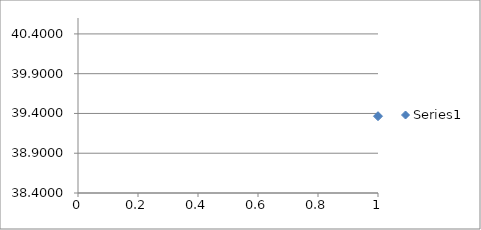
| Category | Series 0 |
|---|---|
| 0 | 39.366 |
| 1 | 39.102 |
| 2 | 39.248 |
| 3 | 39.394 |
| 4 | 39.272 |
| 5 | 39.325 |
| 6 | 40.038 |
| 7 | 39.237 |
| 8 | 40.145 |
| 9 | 39.27 |
| 10 | 39.62 |
| 11 | 39.96 |
| 12 | 40.179 |
| 13 | 40.006 |
| 14 | 39.922 |
| 15 | 39.692 |
| 16 | 39.262 |
| 17 | 39.45 |
| 18 | 38.711 |
| 19 | 39.169 |
| 20 | 39.378 |
| 21 | 38.943 |
| 22 | 39.043 |
| 23 | 39.883 |
| 24 | 39.507 |
| 25 | 39.223 |
| 26 | 39.109 |
| 27 | 39.16 |
| 28 | 39.411 |
| 29 | 39.413 |
| 30 | 39.774 |
| 31 | 39.126 |
| 32 | 39.87 |
| 33 | 39.103 |
| 34 | 39.296 |
| 35 | 39.385 |
| 36 | 40.047 |
| 37 | 40.081 |
| 38 | 39.321 |
| 39 | 39.342 |
| 40 | 39.427 |
| 41 | 39.49 |
| 42 | 39.194 |
| 43 | 39.687 |
| 44 | 40.024 |
| 45 | 40.052 |
| 46 | 39.147 |
| 47 | 39.707 |
| 48 | 38.911 |
| 49 | 39.911 |
| 50 | 38.806 |
| 51 | 39.388 |
| 52 | 40.034 |
| 53 | 39.299 |
| 54 | 39.025 |
| 55 | 39.178 |
| 56 | 40.084 |
| 57 | 39.149 |
| 58 | 39.59 |
| 59 | 39.738 |
| 60 | 39.396 |
| 61 | 39.641 |
| 62 | 39.136 |
| 63 | 39.398 |
| 64 | 39.336 |
| 65 | 39.935 |
| 66 | 39.283 |
| 67 | 39.033 |
| 68 | 39.823 |
| 69 | 39.26 |
| 70 | 40.032 |
| 71 | 39.64 |
| 72 | 39.775 |
| 73 | 39.887 |
| 74 | 39.311 |
| 75 | 39.227 |
| 76 | 40.109 |
| 77 | 40.064 |
| 78 | 39.44 |
| 79 | 39.688 |
| 80 | 39.697 |
| 81 | 39.284 |
| 82 | 39.581 |
| 83 | 40.011 |
| 84 | 39.611 |
| 85 | 39.989 |
| 86 | 38.992 |
| 87 | 39.333 |
| 88 | 39.343 |
| 89 | 39.101 |
| 90 | 38.985 |
| 91 | 39.671 |
| 92 | 39.51 |
| 93 | 39.221 |
| 94 | 39.196 |
| 95 | 39.508 |
| 96 | 39.665 |
| 97 | 39.44 |
| 98 | 38.736 |
| 99 | 38.699 |
| 100 | 39.517 |
| 101 | 39.407 |
| 102 | 39.054 |
| 103 | 40.104 |
| 104 | 39.57 |
| 105 | 39.003 |
| 106 | 38.924 |
| 107 | 39.678 |
| 108 | 39.35 |
| 109 | 39.14 |
| 110 | 39.397 |
| 111 | 39.898 |
| 112 | 39.088 |
| 113 | 39.666 |
| 114 | 39.361 |
| 115 | 39.213 |
| 116 | 39.415 |
| 117 | 38.983 |
| 118 | 39.192 |
| 119 | 39.906 |
| 120 | 39.119 |
| 121 | 39.67 |
| 122 | 38.649 |
| 123 | 39.531 |
| 124 | 38.816 |
| 125 | 39.234 |
| 126 | 40.019 |
| 127 | 39.759 |
| 128 | 39.402 |
| 129 | 38.984 |
| 130 | 39.846 |
| 131 | 39.389 |
| 132 | 39.588 |
| 133 | 39.975 |
| 134 | 38.948 |
| 135 | 39.288 |
| 136 | 40.044 |
| 137 | 39.514 |
| 138 | 39.632 |
| 139 | 39.451 |
| 140 | 39.729 |
| 141 | 39.124 |
| 142 | 39.927 |
| 143 | 39.767 |
| 144 | 39.106 |
| 145 | 40.006 |
| 146 | 39.732 |
| 147 | 39.789 |
| 148 | 39.594 |
| 149 | 39.486 |
| 150 | 39.697 |
| 151 | 40.022 |
| 152 | 38.926 |
| 153 | 39.66 |
| 154 | 39.383 |
| 155 | 39.208 |
| 156 | 39.766 |
| 157 | 39.877 |
| 158 | 39.887 |
| 159 | 39.201 |
| 160 | 39.566 |
| 161 | 39.625 |
| 162 | 39.714 |
| 163 | 39.623 |
| 164 | 39.374 |
| 165 | 39.144 |
| 166 | 40.038 |
| 167 | 39.343 |
| 168 | 39.139 |
| 169 | 39.727 |
| 170 | 39.772 |
| 171 | 39.461 |
| 172 | 39.116 |
| 173 | 39.405 |
| 174 | 39.782 |
| 175 | 39.185 |
| 176 | 39.05 |
| 177 | 38.667 |
| 178 | 39.841 |
| 179 | 39.472 |
| 180 | 40.019 |
| 181 | 39.082 |
| 182 | 39.061 |
| 183 | 38.856 |
| 184 | 39.536 |
| 185 | 40.019 |
| 186 | 39.204 |
| 187 | 40.225 |
| 188 | 39.564 |
| 189 | 39.757 |
| 190 | 39.349 |
| 191 | 39.623 |
| 192 | 38.909 |
| 193 | 39.301 |
| 194 | 39.367 |
| 195 | 40.295 |
| 196 | 39.263 |
| 197 | 39.89 |
| 198 | 39.433 |
| 199 | 39.802 |
| 200 | 39.52 |
| 201 | 39.702 |
| 202 | 38.934 |
| 203 | 39.796 |
| 204 | 39.736 |
| 205 | 39.278 |
| 206 | 39.688 |
| 207 | 39.96 |
| 208 | 40.008 |
| 209 | 39.786 |
| 210 | 39.282 |
| 211 | 39.864 |
| 212 | 40.298 |
| 213 | 39.822 |
| 214 | 39.219 |
| 215 | 39.347 |
| 216 | 39.308 |
| 217 | 39.844 |
| 218 | 39.593 |
| 219 | 39.7 |
| 220 | 39.164 |
| 221 | 39.045 |
| 222 | 39.728 |
| 223 | 39.267 |
| 224 | 38.679 |
| 225 | 39.874 |
| 226 | 39.245 |
| 227 | 38.987 |
| 228 | 39.695 |
| 229 | 39.62 |
| 230 | 39.206 |
| 231 | 39.726 |
| 232 | 39.361 |
| 233 | 38.769 |
| 234 | 39.832 |
| 235 | 39.489 |
| 236 | 40.107 |
| 237 | 39.527 |
| 238 | 39.564 |
| 239 | 38.857 |
| 240 | 39.326 |
| 241 | 39.947 |
| 242 | 39.218 |
| 243 | 38.909 |
| 244 | 39.753 |
| 245 | 39.539 |
| 246 | 39.17 |
| 247 | 39.091 |
| 248 | 39.724 |
| 249 | 39.451 |
| 250 | 38.92 |
| 251 | 39.308 |
| 252 | 39.761 |
| 253 | 39.491 |
| 254 | 39.297 |
| 255 | 39.855 |
| 256 | 40.176 |
| 257 | 39.267 |
| 258 | 39.413 |
| 259 | 39.631 |
| 260 | 38.78 |
| 261 | 39.589 |
| 262 | 39.338 |
| 263 | 39.402 |
| 264 | 39.245 |
| 265 | 39.471 |
| 266 | 40.204 |
| 267 | 39.09 |
| 268 | 39.746 |
| 269 | 39.746 |
| 270 | 39.291 |
| 271 | 39.423 |
| 272 | 39.529 |
| 273 | 39.145 |
| 274 | 38.97 |
| 275 | 40.003 |
| 276 | 39.413 |
| 277 | 39.957 |
| 278 | 39.498 |
| 279 | 39.423 |
| 280 | 39.589 |
| 281 | 39.17 |
| 282 | 40.011 |
| 283 | 38.915 |
| 284 | 39.594 |
| 285 | 39.496 |
| 286 | 40.082 |
| 287 | 39.518 |
| 288 | 39.042 |
| 289 | 39.896 |
| 290 | 39.897 |
| 291 | 39.795 |
| 292 | 39.332 |
| 293 | 39.369 |
| 294 | 39.419 |
| 295 | 39.332 |
| 296 | 39.908 |
| 297 | 38.844 |
| 298 | 39.138 |
| 299 | 39.681 |
| 300 | 39.669 |
| 301 | 39.63 |
| 302 | 39.42 |
| 303 | 38.796 |
| 304 | 39.86 |
| 305 | 39.322 |
| 306 | 39.523 |
| 307 | 39.737 |
| 308 | 39.226 |
| 309 | 39.641 |
| 310 | 39.871 |
| 311 | 38.991 |
| 312 | 39.883 |
| 313 | 39.426 |
| 314 | 39.446 |
| 315 | 40.083 |
| 316 | 39.935 |
| 317 | 39.433 |
| 318 | 39.285 |
| 319 | 38.727 |
| 320 | 39.285 |
| 321 | 39.251 |
| 322 | 39.154 |
| 323 | 39.457 |
| 324 | 39.754 |
| 325 | 39.427 |
| 326 | 39.91 |
| 327 | 39.488 |
| 328 | 38.773 |
| 329 | 39.774 |
| 330 | 39.154 |
| 331 | 39.633 |
| 332 | 39.033 |
| 333 | 39.671 |
| 334 | 39.917 |
| 335 | 39.276 |
| 336 | 39.792 |
| 337 | 39.354 |
| 338 | 39.111 |
| 339 | 38.891 |
| 340 | 39.256 |
| 341 | 39.483 |
| 342 | 39.731 |
| 343 | 39.595 |
| 344 | 39.858 |
| 345 | 39.396 |
| 346 | 39.334 |
| 347 | 39.957 |
| 348 | 39.918 |
| 349 | 39.505 |
| 350 | 39.594 |
| 351 | 40.033 |
| 352 | 39.461 |
| 353 | 39.63 |
| 354 | 39.373 |
| 355 | 39.134 |
| 356 | 39.131 |
| 357 | 39.861 |
| 358 | 38.862 |
| 359 | 39.539 |
| 360 | 38.987 |
| 361 | 39.163 |
| 362 | 39.907 |
| 363 | 39.613 |
| 364 | 39.423 |
| 365 | 39.084 |
| 366 | 39.476 |
| 367 | 39.883 |
| 368 | 39.569 |
| 369 | 39.594 |
| 370 | 39.523 |
| 371 | 39.123 |
| 372 | 40.037 |
| 373 | 40.158 |
| 374 | 39.138 |
| 375 | 39.374 |
| 376 | 39.194 |
| 377 | 39.774 |
| 378 | 39.569 |
| 379 | 39.344 |
| 380 | 38.872 |
| 381 | 39.617 |
| 382 | 39.944 |
| 383 | 39.468 |
| 384 | 39.315 |
| 385 | 39.096 |
| 386 | 39.571 |
| 387 | 39.972 |
| 388 | 39.235 |
| 389 | 39.778 |
| 390 | 39.515 |
| 391 | 39.197 |
| 392 | 39.51 |
| 393 | 39.618 |
| 394 | 39.247 |
| 395 | 39.66 |
| 396 | 39.192 |
| 397 | 39.927 |
| 398 | 39.119 |
| 399 | 39.319 |
| 400 | 39.569 |
| 401 | 39.163 |
| 402 | 39.65 |
| 403 | 38.948 |
| 404 | 39.845 |
| 405 | 39.42 |
| 406 | 39.591 |
| 407 | 39.433 |
| 408 | 39.911 |
| 409 | 39.77 |
| 410 | 39.427 |
| 411 | 38.841 |
| 412 | 39.874 |
| 413 | 40.14 |
| 414 | 39.56 |
| 415 | 39.384 |
| 416 | 38.941 |
| 417 | 39.895 |
| 418 | 39.391 |
| 419 | 39.697 |
| 420 | 40.107 |
| 421 | 39.788 |
| 422 | 39.249 |
| 423 | 39.18 |
| 424 | 39.597 |
| 425 | 40.118 |
| 426 | 39.927 |
| 427 | 39.477 |
| 428 | 39.381 |
| 429 | 39.589 |
| 430 | 39.063 |
| 431 | 39.984 |
| 432 | 39.896 |
| 433 | 39.521 |
| 434 | 39.589 |
| 435 | 39.788 |
| 436 | 39.569 |
| 437 | 39.073 |
| 438 | 39.693 |
| 439 | 39.336 |
| 440 | 39.378 |
| 441 | 39.538 |
| 442 | 39.877 |
| 443 | 39.741 |
| 444 | 39.948 |
| 445 | 39.554 |
| 446 | 39.446 |
| 447 | 39.123 |
| 448 | 39.837 |
| 449 | 39.26 |
| 450 | 40.182 |
| 451 | 39.084 |
| 452 | 39.017 |
| 453 | 39.295 |
| 454 | 38.981 |
| 455 | 39.862 |
| 456 | 39.062 |
| 457 | 39.687 |
| 458 | 39.955 |
| 459 | 39.239 |
| 460 | 39.841 |
| 461 | 39.396 |
| 462 | 39.578 |
| 463 | 39.162 |
| 464 | 39.959 |
| 465 | 39.971 |
| 466 | 39.572 |
| 467 | 39.621 |
| 468 | 39.733 |
| 469 | 39.41 |
| 470 | 39.832 |
| 471 | 39.298 |
| 472 | 39.268 |
| 473 | 38.745 |
| 474 | 39.786 |
| 475 | 39.966 |
| 476 | 40.146 |
| 477 | 39.236 |
| 478 | 39.735 |
| 479 | 39.298 |
| 480 | 39.036 |
| 481 | 39.174 |
| 482 | 39.151 |
| 483 | 39.701 |
| 484 | 39.712 |
| 485 | 38.876 |
| 486 | 39.508 |
| 487 | 39.09 |
| 488 | 38.958 |
| 489 | 39.545 |
| 490 | 39.26 |
| 491 | 39.221 |
| 492 | 39.693 |
| 493 | 39.791 |
| 494 | 39.717 |
| 495 | 40.24 |
| 496 | 39.397 |
| 497 | 39.661 |
| 498 | 39.625 |
| 499 | 39.808 |
| 500 | 39.917 |
| 501 | 39.147 |
| 502 | 39.525 |
| 503 | 39.155 |
| 504 | 39.798 |
| 505 | 39.033 |
| 506 | 38.972 |
| 507 | 39.169 |
| 508 | 39.298 |
| 509 | 38.785 |
| 510 | 39.712 |
| 511 | 39.416 |
| 512 | 39.528 |
| 513 | 39.534 |
| 514 | 39.132 |
| 515 | 39.413 |
| 516 | 39.867 |
| 517 | 39.494 |
| 518 | 38.856 |
| 519 | 39.045 |
| 520 | 40.129 |
| 521 | 39.067 |
| 522 | 39.445 |
| 523 | 39.502 |
| 524 | 39.495 |
| 525 | 39.686 |
| 526 | 39.152 |
| 527 | 39.68 |
| 528 | 39.564 |
| 529 | 39.112 |
| 530 | 39.297 |
| 531 | 39.409 |
| 532 | 39.207 |
| 533 | 39.516 |
| 534 | 39.845 |
| 535 | 39.714 |
| 536 | 39.176 |
| 537 | 39.048 |
| 538 | 39.47 |
| 539 | 39.568 |
| 540 | 39.199 |
| 541 | 39.083 |
| 542 | 38.998 |
| 543 | 39.569 |
| 544 | 39.02 |
| 545 | 38.864 |
| 546 | 38.854 |
| 547 | 39.534 |
| 548 | 39.254 |
| 549 | 39.977 |
| 550 | 38.784 |
| 551 | 40.015 |
| 552 | 39.221 |
| 553 | 39.346 |
| 554 | 38.976 |
| 555 | 39.097 |
| 556 | 39.526 |
| 557 | 39.615 |
| 558 | 39.052 |
| 559 | 39.894 |
| 560 | 39.752 |
| 561 | 39.658 |
| 562 | 38.906 |
| 563 | 39.086 |
| 564 | 39.578 |
| 565 | 39.521 |
| 566 | 39.194 |
| 567 | 40.115 |
| 568 | 39.165 |
| 569 | 39.567 |
| 570 | 39.133 |
| 571 | 39.509 |
| 572 | 39.15 |
| 573 | 40.235 |
| 574 | 38.927 |
| 575 | 40.153 |
| 576 | 38.803 |
| 577 | 39.069 |
| 578 | 39.871 |
| 579 | 39.216 |
| 580 | 39.483 |
| 581 | 39.906 |
| 582 | 39.627 |
| 583 | 39.634 |
| 584 | 39.886 |
| 585 | 40.033 |
| 586 | 39.051 |
| 587 | 39.48 |
| 588 | 39.542 |
| 589 | 38.896 |
| 590 | 39.754 |
| 591 | 40.194 |
| 592 | 39.452 |
| 593 | 38.975 |
| 594 | 39.999 |
| 595 | 40.059 |
| 596 | 39.07 |
| 597 | 40.072 |
| 598 | 39.338 |
| 599 | 39.063 |
| 600 | 39.871 |
| 601 | 39.457 |
| 602 | 39.232 |
| 603 | 39.442 |
| 604 | 39.636 |
| 605 | 39.76 |
| 606 | 39.834 |
| 607 | 39.602 |
| 608 | 39.546 |
| 609 | 40.083 |
| 610 | 40.184 |
| 611 | 39.506 |
| 612 | 39.173 |
| 613 | 39.07 |
| 614 | 39.25 |
| 615 | 38.905 |
| 616 | 39.096 |
| 617 | 39.454 |
| 618 | 39.343 |
| 619 | 39.596 |
| 620 | 39.382 |
| 621 | 39.537 |
| 622 | 39.11 |
| 623 | 38.805 |
| 624 | 38.939 |
| 625 | 39.269 |
| 626 | 39.681 |
| 627 | 38.731 |
| 628 | 39.877 |
| 629 | 39.62 |
| 630 | 38.938 |
| 631 | 39.903 |
| 632 | 39.304 |
| 633 | 39.195 |
| 634 | 39.485 |
| 635 | 39.489 |
| 636 | 40.076 |
| 637 | 39.214 |
| 638 | 39.29 |
| 639 | 39.015 |
| 640 | 39.509 |
| 641 | 39.399 |
| 642 | 39.582 |
| 643 | 38.981 |
| 644 | 40.02 |
| 645 | 39.276 |
| 646 | 39.874 |
| 647 | 39.324 |
| 648 | 39.789 |
| 649 | 39.226 |
| 650 | 39.146 |
| 651 | 39.91 |
| 652 | 39.8 |
| 653 | 38.967 |
| 654 | 39.227 |
| 655 | 39.92 |
| 656 | 39.971 |
| 657 | 39.173 |
| 658 | 40.071 |
| 659 | 38.978 |
| 660 | 39.164 |
| 661 | 39.47 |
| 662 | 39.656 |
| 663 | 39.264 |
| 664 | 39.626 |
| 665 | 39.228 |
| 666 | 39.027 |
| 667 | 39.133 |
| 668 | 39.625 |
| 669 | 40.215 |
| 670 | 39.155 |
| 671 | 39.043 |
| 672 | 39.493 |
| 673 | 39.318 |
| 674 | 39.007 |
| 675 | 39.202 |
| 676 | 38.896 |
| 677 | 39.25 |
| 678 | 39.646 |
| 679 | 39.533 |
| 680 | 39.294 |
| 681 | 39.345 |
| 682 | 39.444 |
| 683 | 38.649 |
| 684 | 39.233 |
| 685 | 39.523 |
| 686 | 39.68 |
| 687 | 39.815 |
| 688 | 39.423 |
| 689 | 39.59 |
| 690 | 39.73 |
| 691 | 39.614 |
| 692 | 39.008 |
| 693 | 40.026 |
| 694 | 39.279 |
| 695 | 39.835 |
| 696 | 39.396 |
| 697 | 39.671 |
| 698 | 39.666 |
| 699 | 39.625 |
| 700 | 39.291 |
| 701 | 39.093 |
| 702 | 39.844 |
| 703 | 39.475 |
| 704 | 39.789 |
| 705 | 39.336 |
| 706 | 39.785 |
| 707 | 39.254 |
| 708 | 39.083 |
| 709 | 40.251 |
| 710 | 40.055 |
| 711 | 39.546 |
| 712 | 39.216 |
| 713 | 39.215 |
| 714 | 38.605 |
| 715 | 39.628 |
| 716 | 39.397 |
| 717 | 39.764 |
| 718 | 38.847 |
| 719 | 39.337 |
| 720 | 39.334 |
| 721 | 38.978 |
| 722 | 38.875 |
| 723 | 40.073 |
| 724 | 38.712 |
| 725 | 39.217 |
| 726 | 40.071 |
| 727 | 39.122 |
| 728 | 39.545 |
| 729 | 39.35 |
| 730 | 38.789 |
| 731 | 39.443 |
| 732 | 39.797 |
| 733 | 39.641 |
| 734 | 39.753 |
| 735 | 39.58 |
| 736 | 39.507 |
| 737 | 39.398 |
| 738 | 39.199 |
| 739 | 39.529 |
| 740 | 39.751 |
| 741 | 39.478 |
| 742 | 38.867 |
| 743 | 39.827 |
| 744 | 39.66 |
| 745 | 39.576 |
| 746 | 39.101 |
| 747 | 39.864 |
| 748 | 39.39 |
| 749 | 39.626 |
| 750 | 39.811 |
| 751 | 38.63 |
| 752 | 39.545 |
| 753 | 39.435 |
| 754 | 39.583 |
| 755 | 39.837 |
| 756 | 38.734 |
| 757 | 39.206 |
| 758 | 40.137 |
| 759 | 38.99 |
| 760 | 39.598 |
| 761 | 39.228 |
| 762 | 38.797 |
| 763 | 39.439 |
| 764 | 39.687 |
| 765 | 39.496 |
| 766 | 39.542 |
| 767 | 38.87 |
| 768 | 39.888 |
| 769 | 39.975 |
| 770 | 39.619 |
| 771 | 39.541 |
| 772 | 38.933 |
| 773 | 38.837 |
| 774 | 39.956 |
| 775 | 39.516 |
| 776 | 39.945 |
| 777 | 39.039 |
| 778 | 39.233 |
| 779 | 39.805 |
| 780 | 40.051 |
| 781 | 39.292 |
| 782 | 39.666 |
| 783 | 39.134 |
| 784 | 39.801 |
| 785 | 39.853 |
| 786 | 39.975 |
| 787 | 39.2 |
| 788 | 39.37 |
| 789 | 39.776 |
| 790 | 39.407 |
| 791 | 39.056 |
| 792 | 39.29 |
| 793 | 39.74 |
| 794 | 39.757 |
| 795 | 39.602 |
| 796 | 38.961 |
| 797 | 38.861 |
| 798 | 39.291 |
| 799 | 39.144 |
| 800 | 39.982 |
| 801 | 39.088 |
| 802 | 38.792 |
| 803 | 39.31 |
| 804 | 39.318 |
| 805 | 39.689 |
| 806 | 39.49 |
| 807 | 40.031 |
| 808 | 39.373 |
| 809 | 39.865 |
| 810 | 39.173 |
| 811 | 40.012 |
| 812 | 38.872 |
| 813 | 39.621 |
| 814 | 39.88 |
| 815 | 39.083 |
| 816 | 39.463 |
| 817 | 39.503 |
| 818 | 39.345 |
| 819 | 39.662 |
| 820 | 38.665 |
| 821 | 39.726 |
| 822 | 39.249 |
| 823 | 39.456 |
| 824 | 39.583 |
| 825 | 39.891 |
| 826 | 39.817 |
| 827 | 39.261 |
| 828 | 39.716 |
| 829 | 39.372 |
| 830 | 39.477 |
| 831 | 39.32 |
| 832 | 39.188 |
| 833 | 38.919 |
| 834 | 39.761 |
| 835 | 39.39 |
| 836 | 39.185 |
| 837 | 39.359 |
| 838 | 38.985 |
| 839 | 39.198 |
| 840 | 39.833 |
| 841 | 38.933 |
| 842 | 39.665 |
| 843 | 39.491 |
| 844 | 38.799 |
| 845 | 39.605 |
| 846 | 39.285 |
| 847 | 39.054 |
| 848 | 39.599 |
| 849 | 39.178 |
| 850 | 39.654 |
| 851 | 39.414 |
| 852 | 39.198 |
| 853 | 39.073 |
| 854 | 39.684 |
| 855 | 39.854 |
| 856 | 40.06 |
| 857 | 39.779 |
| 858 | 39.12 |
| 859 | 39.637 |
| 860 | 38.735 |
| 861 | 39.231 |
| 862 | 38.969 |
| 863 | 39.545 |
| 864 | 39.898 |
| 865 | 39.722 |
| 866 | 39.162 |
| 867 | 38.873 |
| 868 | 39.34 |
| 869 | 38.993 |
| 870 | 39.349 |
| 871 | 39.7 |
| 872 | 39.637 |
| 873 | 39.529 |
| 874 | 39.559 |
| 875 | 38.688 |
| 876 | 39.376 |
| 877 | 38.696 |
| 878 | 39.356 |
| 879 | 39.278 |
| 880 | 39.419 |
| 881 | 38.979 |
| 882 | 38.778 |
| 883 | 39.633 |
| 884 | 39.498 |
| 885 | 39.444 |
| 886 | 39.567 |
| 887 | 39.306 |
| 888 | 39.713 |
| 889 | 38.745 |
| 890 | 39.919 |
| 891 | 39.841 |
| 892 | 39.728 |
| 893 | 39.186 |
| 894 | 39.978 |
| 895 | 38.999 |
| 896 | 39.977 |
| 897 | 38.728 |
| 898 | 39.339 |
| 899 | 39.734 |
| 900 | 39.548 |
| 901 | 39.034 |
| 902 | 39.36 |
| 903 | 39.296 |
| 904 | 38.979 |
| 905 | 38.908 |
| 906 | 38.823 |
| 907 | 39.86 |
| 908 | 39.471 |
| 909 | 39.983 |
| 910 | 39.465 |
| 911 | 39.575 |
| 912 | 39.043 |
| 913 | 39.317 |
| 914 | 39.847 |
| 915 | 39.821 |
| 916 | 39.708 |
| 917 | 40.014 |
| 918 | 39.192 |
| 919 | 39.525 |
| 920 | 39.328 |
| 921 | 39.445 |
| 922 | 39.655 |
| 923 | 39.146 |
| 924 | 39.341 |
| 925 | 40.19 |
| 926 | 39.699 |
| 927 | 39.907 |
| 928 | 39.46 |
| 929 | 40.021 |
| 930 | 39.843 |
| 931 | 39.055 |
| 932 | 39.75 |
| 933 | 39.358 |
| 934 | 39.863 |
| 935 | 39.586 |
| 936 | 39.063 |
| 937 | 39.147 |
| 938 | 38.932 |
| 939 | 39.519 |
| 940 | 39.624 |
| 941 | 39.379 |
| 942 | 39.695 |
| 943 | 39.676 |
| 944 | 39.645 |
| 945 | 40.038 |
| 946 | 39.648 |
| 947 | 39.437 |
| 948 | 39.964 |
| 949 | 38.67 |
| 950 | 39.307 |
| 951 | 39.669 |
| 952 | 39.412 |
| 953 | 39.69 |
| 954 | 39.242 |
| 955 | 39.308 |
| 956 | 38.918 |
| 957 | 39.241 |
| 958 | 38.926 |
| 959 | 39.637 |
| 960 | 39.683 |
| 961 | 39.851 |
| 962 | 39.432 |
| 963 | 39.711 |
| 964 | 39.357 |
| 965 | 39.414 |
| 966 | 39.835 |
| 967 | 39.563 |
| 968 | 38.947 |
| 969 | 40.148 |
| 970 | 39.156 |
| 971 | 39.186 |
| 972 | 39.455 |
| 973 | 39.185 |
| 974 | 39.783 |
| 975 | 39.995 |
| 976 | 39.401 |
| 977 | 39.372 |
| 978 | 38.94 |
| 979 | 39.29 |
| 980 | 40.158 |
| 981 | 39.264 |
| 982 | 38.989 |
| 983 | 39.413 |
| 984 | 39.33 |
| 985 | 39.016 |